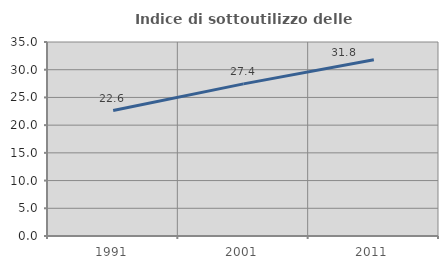
| Category | Indice di sottoutilizzo delle abitazioni  |
|---|---|
| 1991.0 | 22.641 |
| 2001.0 | 27.449 |
| 2011.0 | 31.798 |